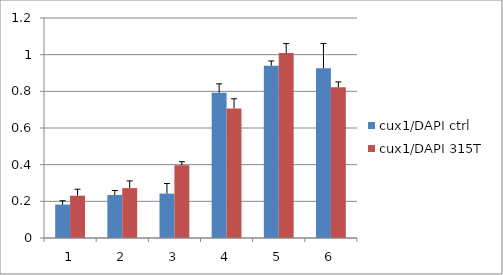
| Category | cux1/DAPI ctrl | cux1/DAPI 315T |
|---|---|---|
| 0 | 0.182 | 0.231 |
| 1 | 0.235 | 0.272 |
| 2 | 0.242 | 0.397 |
| 3 | 0.792 | 0.707 |
| 4 | 0.94 | 1.009 |
| 5 | 0.926 | 0.822 |